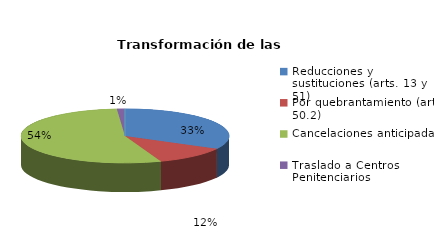
| Category | Series 0 |
|---|---|
| Reducciones y sustituciones (arts. 13 y 51) | 159 |
| Por quebrantamiento (art. 50.2) | 56 |
| Cancelaciones anticipadas | 263 |
| Traslado a Centros Penitenciarios | 6 |
| Conversión internamientos en cerrados (art. 51.2) | 0 |